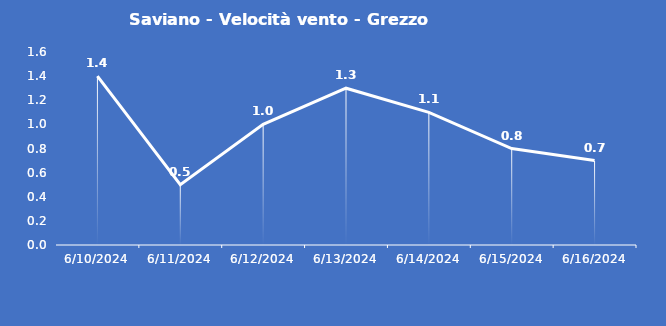
| Category | Saviano - Velocità vento - Grezzo (m/s) |
|---|---|
| 6/10/24 | 1.4 |
| 6/11/24 | 0.5 |
| 6/12/24 | 1 |
| 6/13/24 | 1.3 |
| 6/14/24 | 1.1 |
| 6/15/24 | 0.8 |
| 6/16/24 | 0.7 |